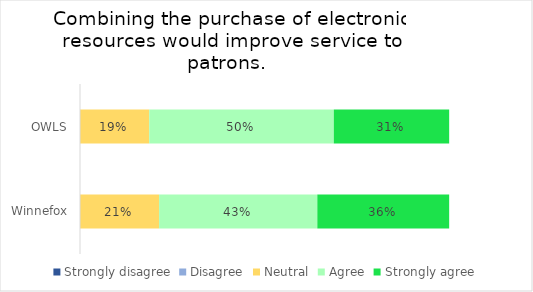
| Category | Strongly disagree | Disagree | Neutral | Agree | Strongly agree |
|---|---|---|---|---|---|
| OWLS | 0 | 0 | 0.188 | 0.5 | 0.312 |
| Winnefox | 0 | 0 | 0.214 | 0.429 | 0.357 |